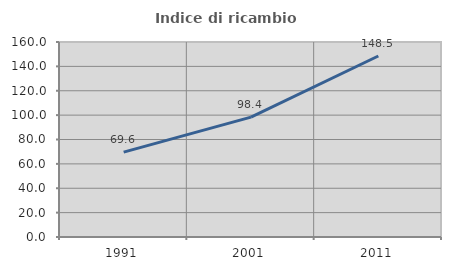
| Category | Indice di ricambio occupazionale  |
|---|---|
| 1991.0 | 69.605 |
| 2001.0 | 98.377 |
| 2011.0 | 148.496 |